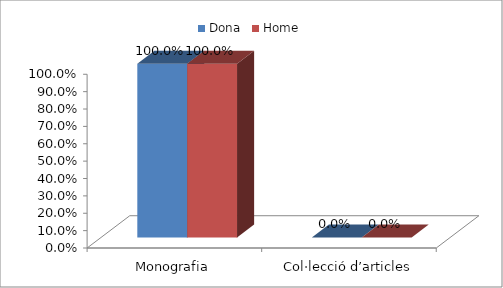
| Category | Dona | Home |
|---|---|---|
| Monografia | 1 | 1 |
| Col·lecció d’articles | 0 | 0 |